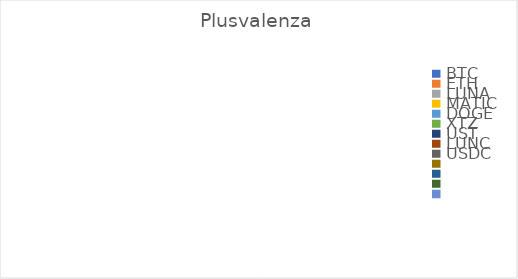
| Category | Plusvalenza |
|---|---|
| BTC | 0 |
| ETH | 0 |
| LUNA | 0 |
| MATIC | 0 |
| DOGE | 0 |
| XTZ | 0 |
| UST | 0 |
| LUNC | 0 |
| USDC | 0 |